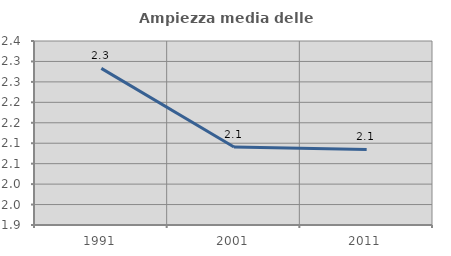
| Category | Ampiezza media delle famiglie |
|---|---|
| 1991.0 | 2.283 |
| 2001.0 | 2.091 |
| 2011.0 | 2.085 |